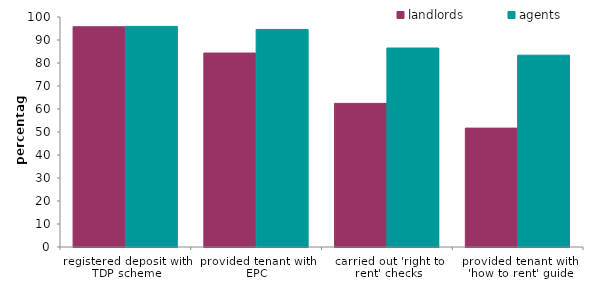
| Category | landlords | agents |
|---|---|---|
| registered deposit with TDP scheme | 95.771 | 95.919 |
| provided tenant with EPC | 84.322 | 94.598 |
| carried out 'right to rent' checks | 62.452 | 86.519 |
| provided tenant with 'how to rent' guide | 51.69 | 83.396 |